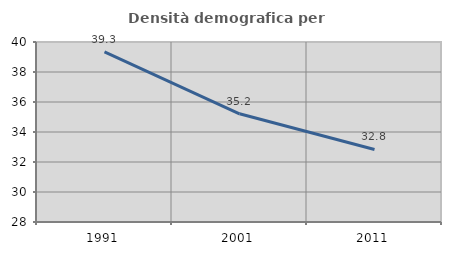
| Category | Densità demografica |
|---|---|
| 1991.0 | 39.347 |
| 2001.0 | 35.214 |
| 2011.0 | 32.836 |